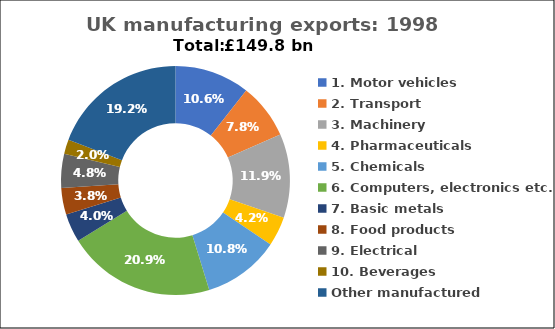
| Category | Series 0 |
|---|---|
| 1. Motor vehicles  | 15.857 |
| 2. Transport | 11.709 |
| 3. Machinery | 17.771 |
| 4. Pharmaceuticals | 6.216 |
| 5. Chemicals | 16.194 |
| 6. Computers, electronics etc. | 31.336 |
| 7. Basic metals | 6.055 |
| 8. Food products | 5.638 |
| 9. Electrical | 7.17 |
| 10. Beverages | 3.013 |
| Other manufactured | 28.792 |